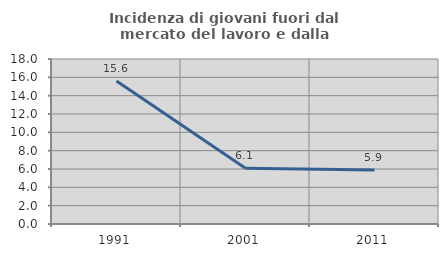
| Category | Incidenza di giovani fuori dal mercato del lavoro e dalla formazione  |
|---|---|
| 1991.0 | 15.596 |
| 2001.0 | 6.071 |
| 2011.0 | 5.892 |